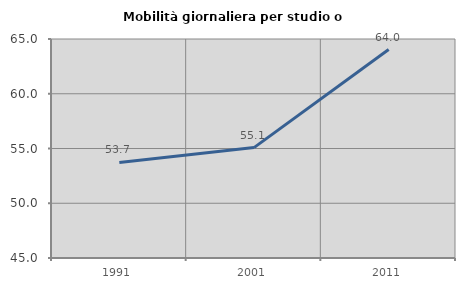
| Category | Mobilità giornaliera per studio o lavoro |
|---|---|
| 1991.0 | 53.723 |
| 2001.0 | 55.081 |
| 2011.0 | 64.036 |